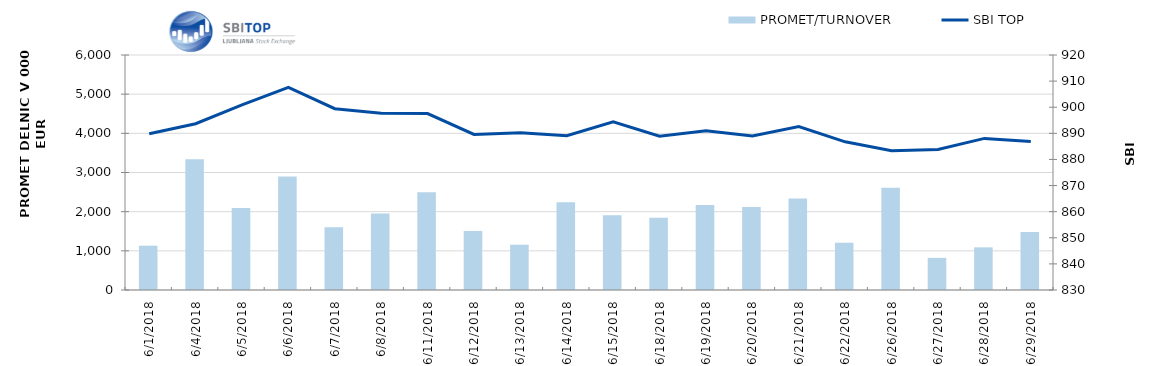
| Category | PROMET/TURNOVER |
|---|---|
| 6/1/18 | 1131 |
| 6/4/18 | 3336 |
| 6/5/18 | 2096 |
| 6/6/18 | 2899 |
| 6/7/18 | 1599 |
| 6/8/18 | 1954 |
| 6/11/18 | 2494 |
| 6/12/18 | 1507 |
| 6/13/18 | 1157 |
| 6/14/18 | 2242 |
| 6/15/18 | 1908 |
| 6/18/18 | 1843 |
| 6/19/18 | 2169 |
| 6/20/18 | 2117 |
| 6/21/18 | 2336 |
| 6/22/18 | 1207 |
| 6/26/18 | 2611 |
| 6/27/18 | 821 |
| 6/28/18 | 1089 |
| 6/29/18 | 1484 |